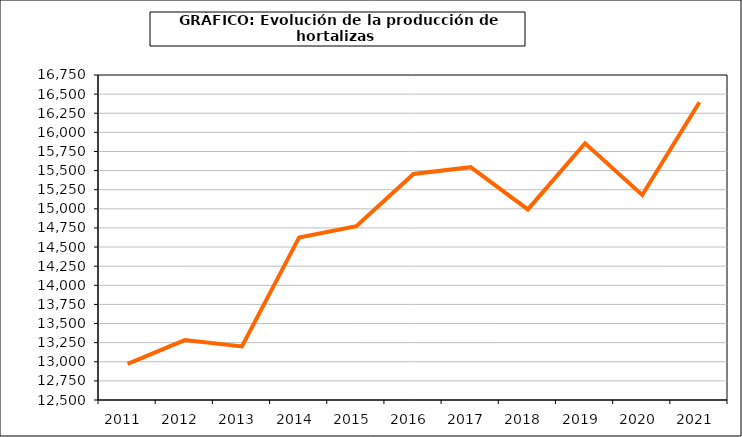
| Category | producción |
|---|---|
| 2011.0 | 12972.604 |
| 2012.0 | 13282.939 |
| 2013.0 | 13201.085 |
| 2014.0 | 14626.126 |
| 2015.0 | 14772.496 |
| 2016.0 | 15456.102 |
| 2017.0 | 15544.603 |
| 2018.0 | 14992.109 |
| 2019.0 | 15857.731 |
| 2020.0 | 15180.448 |
| 2021.0 | 16392.999 |